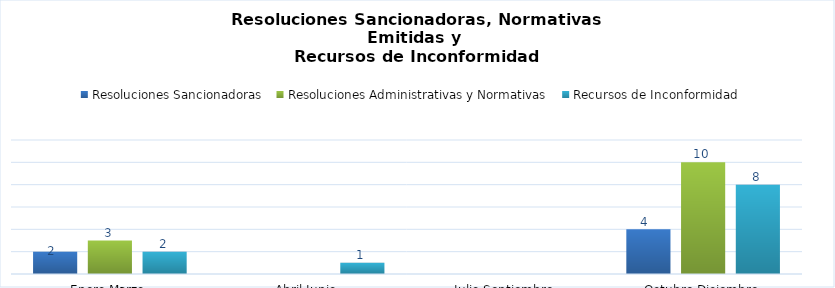
| Category | Resoluciones Sancionadoras | Resoluciones Administrativas y Normativas | Recursos de Inconformidad |
|---|---|---|---|
| Enero-Marzo | 2 | 3 | 2 |
| Abril-Junio | 0 | 0 | 1 |
| Julio-Septiembre | 0 | 0 | 0 |
| Octubre-Diciembre | 4 | 10 | 8 |